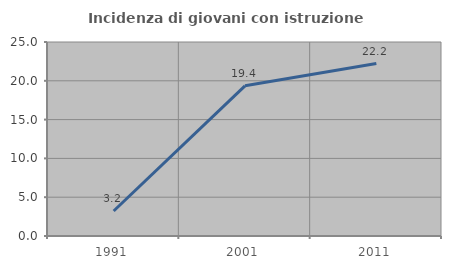
| Category | Incidenza di giovani con istruzione universitaria |
|---|---|
| 1991.0 | 3.226 |
| 2001.0 | 19.355 |
| 2011.0 | 22.222 |